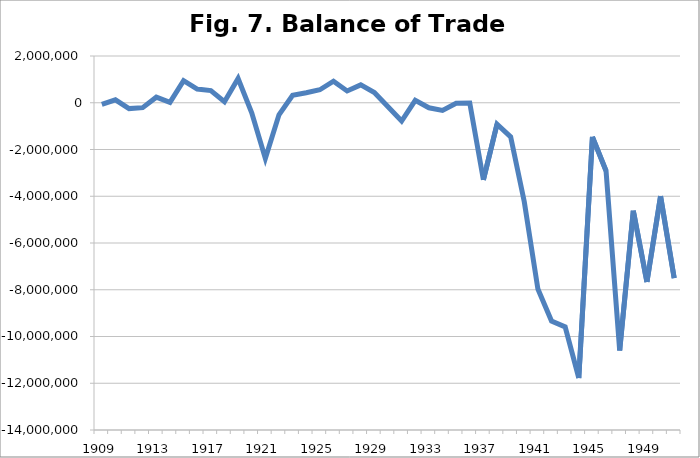
| Category | Balance of Trade |
|---|---|
| 1909.0 | -70734 |
| 1910.0 | 124577 |
| 1911.0 | -249362 |
| 1912.0 | -209748 |
| 1913.0 | 237313 |
| 1914.0 | 18044 |
| 1915.0 | 948760 |
| 1916.0 | 586444 |
| 1917.0 | 519277 |
| 1918.0 | 40619 |
| 1919.0 | 1039360 |
| 1920.0 | -433317 |
| 1921.0 | -2381487 |
| 1922.0 | -517296 |
| 1923.0 | 322013 |
| 1924.0 | 430274 |
| 1925.0 | 555556 |
| 1926.0 | 924213 |
| 1927.0 | 506413 |
| 1928.0 | 765583 |
| 1929.0 | 440418 |
| 1930.0 | -173620 |
| 1931.0 | -782000 |
| 1932.0 | 101000 |
| 1933.0 | -215000 |
| 1934.0 | -325000 |
| 1935.0 | -24000 |
| 1936.0 | -9000 |
| 1937.0 | -3297000 |
| 1938.0 | -917000 |
| 1939.0 | -1459000 |
| 1940.0 | -4236000 |
| 1941.0 | -7971000 |
| 1942.0 | -9340000 |
| 1943.0 | -9586000 |
| 1944.0 | -11776000 |
| 1945.0 | -1458333.333 |
| 1946.0 | -2916666.667 |
| 1947.0 | -10599000 |
| 1948.0 | -4620000 |
| 1949.0 | -7666000 |
| 1950.0 | -4000000 |
| 1951.0 | -7500000 |